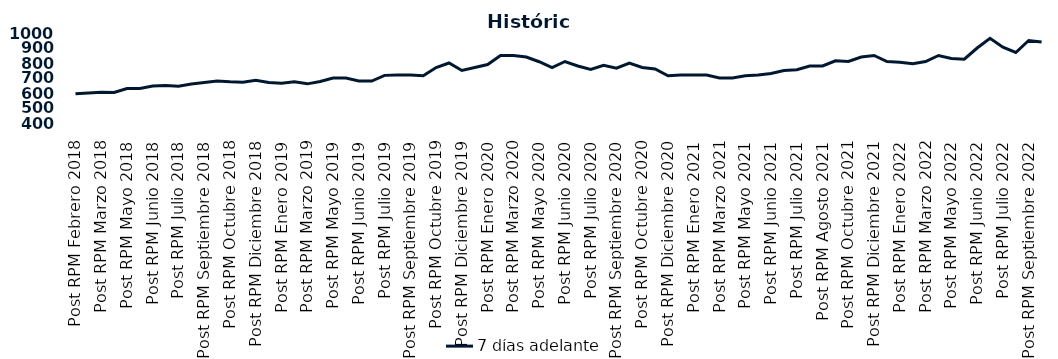
| Category | 7 días adelante  |
|---|---|
| Post RPM Febrero 2018 | 595 |
| Pre RPM Marzo 2018 | 600 |
| Post RPM Marzo 2018 | 605 |
| Pre RPM Mayo 2018 | 603 |
| Post RPM Mayo 2018 | 630 |
| Pre RPM Junio 2018 | 630 |
| Post RPM Junio 2018 | 646.5 |
| Pre RPM Julio 2018 | 650 |
| Post RPM Julio 2018 | 645 |
| Pre RPM Septiembre 2018 | 660 |
| Post RPM Septiembre 2018 | 670 |
| Pre RPM Octubre 2018 | 680 |
| Post RPM Octubre 2018 | 675 |
| Pre RPM Diciembre 2018 | 672.5 |
| Post RPM Diciembre 2018 | 685 |
| Pre RPM Enero 2019 | 670 |
| Post RPM Enero 2019 | 665 |
| Pre RPM Marzo 2019 | 675 |
| Post RPM Marzo 2019 | 661 |
| Pre RPM Mayo 2019 | 677 |
| Post RPM Mayo 2019 | 700 |
| Pre RPM Junio 2019 | 700.5 |
| Post RPM Junio 2019 | 680 |
| Pre RPM Julio 2019 | 680 |
| Post RPM Julio 2019 | 717.5 |
| Pre RPM Septiembre 2019 | 720 |
| Post RPM Septiembre 2019 | 720 |
| Pre RPM Octubre 2019 | 715 |
| Post RPM Octubre 2019 | 770 |
| Pre RPM Diciembre 2019 | 800 |
| Post RPM Diciembre 2019 | 750 |
| Pre RPM Enero 2020 | 770 |
| Post RPM Enero 2020 | 790 |
| Pre RPM Marzo 2020 | 850 |
| Post RPM Marzo 2020 | 850 |
| Pre RPM Mayo 2020 | 840 |
| Post RPM Mayo 2020 | 808.5 |
| Pre RPM Junio 2020 | 770 |
| Post RPM Junio 2020 | 810 |
| Pre RPM Julio 2020 | 780 |
| Post RPM Julio 2020 | 757 |
| Pre RPM Septiembre 2020 | 785 |
| Post RPM Septiembre 2020 | 765 |
| Pre RPM Octubre 2020 | 800 |
| Post RPM Octubre 2020 | 770 |
| Pre RPM Diciembre 2020 | 760 |
| Post RPM Diciembre 2020 | 715 |
| Pre RPM Enero 2021 | 720 |
| Post RPM Enero 2021 | 720 |
| Pre RPM Marzo 2021 | 720 |
| Post RPM Marzo 2021 | 700 |
| Pre RPM Mayo 2021 | 700 |
| Post RPM Mayo 2021 | 715 |
| Pre RPM Junio 2021 | 720 |
| Post RPM Junio 2021 | 730 |
| Pre RPM Julio 2021 | 750 |
| Post RPM Julio 2021 | 755 |
| Pre RPM Agosto 2021 | 780 |
| Post RPM Agosto 2021 | 780 |
| Pre RPM Octubre 2021 | 815 |
| Post RPM Octubre 2021 | 810 |
| Pre RPM Diciembre 2021 | 840 |
| Post RPM Diciembre 2021 | 850 |
| Pre RPM Enero 2022 | 810 |
| Post RPM Enero 2022 | 805 |
| Pre RPM Marzo 2022 | 795 |
| Post RPM Marzo 2022 | 810 |
| Pre RPM Mayo 2022 | 850 |
| Post RPM Mayo 2022 | 830 |
| Pre RPM Junio 2022 | 825 |
| Post RPM Junio 2022 | 900 |
| Pre RPM Julio 2022 | 965 |
| Post RPM Julio 2022 | 905 |
| Pre RPM Septiembre 2022 | 870 |
| Post RPM Septiembre 2022 | 950 |
| Pre RPM Octubre 2022 | 940 |